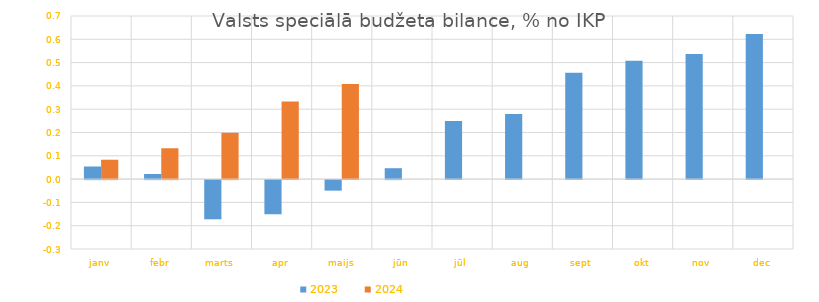
| Category | 2023 | 2024 |
|---|---|---|
| janv | 0.054 | 0.083 |
| febr | 0.022 | 0.132 |
| marts | -0.168 | 0.199 |
| apr | -0.147 | 0.333 |
| maijs | -0.045 | 0.408 |
| jūn | 0.047 | 0 |
| jūl | 0.249 | 0 |
| aug | 0.28 | 0 |
| sept | 0.456 | 0 |
| okt | 0.508 | 0 |
| nov | 0.536 | 0 |
| dec | 0.623 | 0 |